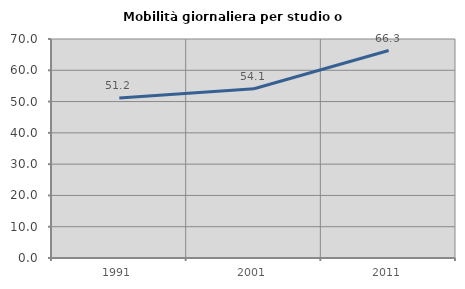
| Category | Mobilità giornaliera per studio o lavoro |
|---|---|
| 1991.0 | 51.166 |
| 2001.0 | 54.112 |
| 2011.0 | 66.317 |